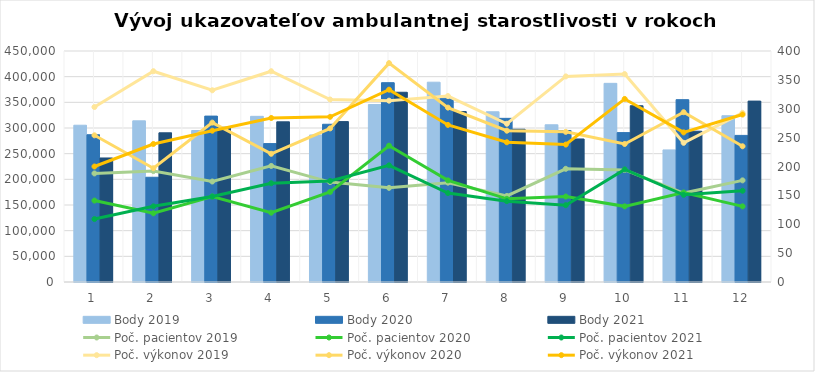
| Category | Body 2019 | Body 2020 | Body 2021 |
|---|---|---|---|
| 0 | 305410 | 286900 | 241600 |
| 1 | 313930 | 204040 | 290600 |
| 2 | 295110 | 323180 | 301390 |
| 3 | 322720 | 269600 | 312010 |
| 4 | 286350 | 307300 | 312420 |
| 5 | 345690 | 388280 | 369640 |
| 6 | 389225 | 358150 | 332000 |
| 7 | 331600 | 318800 | 297600 |
| 8 | 306250 | 295160 | 278640 |
| 9 | 386990 | 291000 | 343400 |
| 10 | 257300 | 355200 | 293700 |
| 11 | 323870 | 285600 | 352400 |